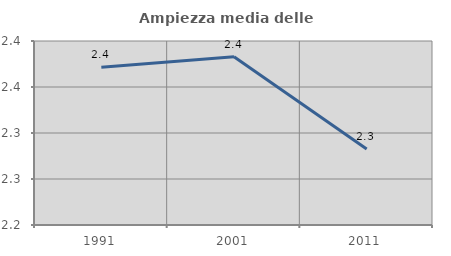
| Category | Ampiezza media delle famiglie |
|---|---|
| 1991.0 | 2.371 |
| 2001.0 | 2.383 |
| 2011.0 | 2.283 |